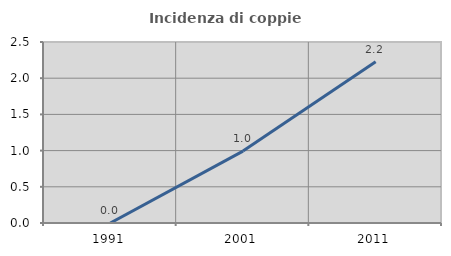
| Category | Incidenza di coppie miste |
|---|---|
| 1991.0 | 0 |
| 2001.0 | 0.993 |
| 2011.0 | 2.228 |